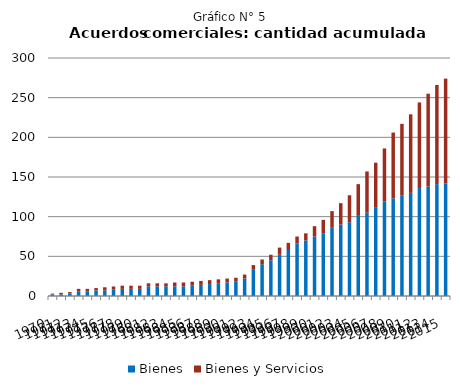
| Category | Bienes | Bienes y Servicios |
|---|---|---|
| 1970.0 | 2 | 1 |
| 1971.0 | 2 | 2 |
| 1972.0 | 3 | 2 |
| 1973.0 | 6 | 3 |
| 1974.0 | 6 | 3 |
| 1975.0 | 7 | 3 |
| 1976.0 | 7 | 4 |
| 1977.0 | 8 | 4 |
| 1978.0 | 9 | 4 |
| 1979.0 | 9 | 4 |
| 1980.0 | 9 | 4 |
| 1981.0 | 12 | 4 |
| 1982.0 | 12 | 4 |
| 1983.0 | 12 | 4 |
| 1984.0 | 12 | 5 |
| 1985.0 | 12 | 5 |
| 1986.0 | 13 | 5 |
| 1987.0 | 14 | 5 |
| 1988.0 | 15 | 5 |
| 1989.0 | 16 | 5 |
| 1990.0 | 17 | 5 |
| 1991.0 | 18 | 5 |
| 1992.0 | 22 | 5 |
| 1993.0 | 33 | 6 |
| 1994.0 | 40 | 6 |
| 1995.0 | 45 | 7 |
| 1996.0 | 52 | 9 |
| 1997.0 | 58 | 9 |
| 1998.0 | 66 | 9 |
| 1999.0 | 70 | 9 |
| 2000.0 | 75 | 13 |
| 2001.0 | 79 | 17 |
| 2002.0 | 86 | 21 |
| 2003.0 | 90 | 27 |
| 2004.0 | 93 | 34 |
| 2005.0 | 102 | 39 |
| 2006.0 | 105 | 52 |
| 2007.0 | 112 | 56 |
| 2008.0 | 119 | 67 |
| 2009.0 | 123 | 83 |
| 2010.0 | 127 | 90 |
| 2011.0 | 130 | 99 |
| 2012.0 | 136 | 108 |
| 2013.0 | 138 | 117 |
| 2014.0 | 141 | 125 |
| 2015.0 | 142 | 132 |